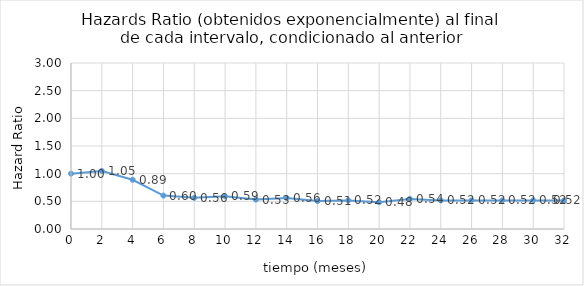
| Category | Series 0 |
|---|---|
| 0.0 | 1 |
| 2.0 | 1.049 |
| 4.0 | 0.89 |
| 6.0 | 0.604 |
| 8.0 | 0.563 |
| 10.0 | 0.593 |
| 12.0 | 0.532 |
| 14.0 | 0.561 |
| 16.0 | 0.505 |
| 18.0 | 0.517 |
| 20.0 | 0.485 |
| 22.0 | 0.543 |
| 24.0 | 0.517 |
| 26.0 | 0.517 |
| 28.0 | 0.517 |
| 30.0 | 0.517 |
| 32.0 | 0.517 |